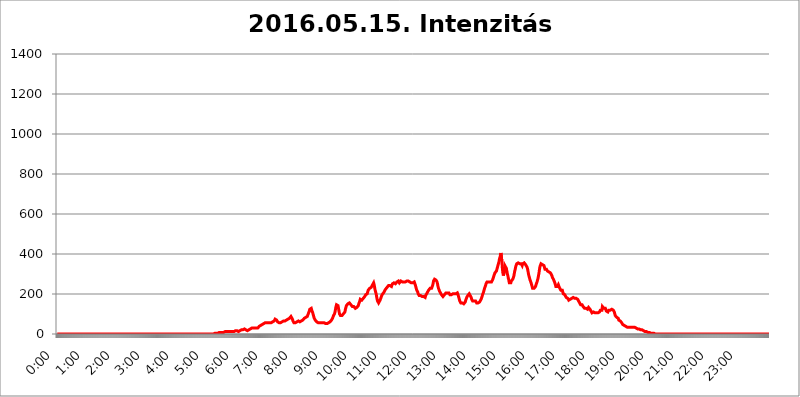
| Category | 2016.05.15. Intenzitás [W/m^2] |
|---|---|
| 0.0 | 0 |
| 0.0006944444444444445 | 0 |
| 0.001388888888888889 | 0 |
| 0.0020833333333333333 | 0 |
| 0.002777777777777778 | 0 |
| 0.003472222222222222 | 0 |
| 0.004166666666666667 | 0 |
| 0.004861111111111111 | 0 |
| 0.005555555555555556 | 0 |
| 0.0062499999999999995 | 0 |
| 0.006944444444444444 | 0 |
| 0.007638888888888889 | 0 |
| 0.008333333333333333 | 0 |
| 0.009027777777777779 | 0 |
| 0.009722222222222222 | 0 |
| 0.010416666666666666 | 0 |
| 0.011111111111111112 | 0 |
| 0.011805555555555555 | 0 |
| 0.012499999999999999 | 0 |
| 0.013194444444444444 | 0 |
| 0.013888888888888888 | 0 |
| 0.014583333333333332 | 0 |
| 0.015277777777777777 | 0 |
| 0.015972222222222224 | 0 |
| 0.016666666666666666 | 0 |
| 0.017361111111111112 | 0 |
| 0.018055555555555557 | 0 |
| 0.01875 | 0 |
| 0.019444444444444445 | 0 |
| 0.02013888888888889 | 0 |
| 0.020833333333333332 | 0 |
| 0.02152777777777778 | 0 |
| 0.022222222222222223 | 0 |
| 0.02291666666666667 | 0 |
| 0.02361111111111111 | 0 |
| 0.024305555555555556 | 0 |
| 0.024999999999999998 | 0 |
| 0.025694444444444447 | 0 |
| 0.02638888888888889 | 0 |
| 0.027083333333333334 | 0 |
| 0.027777777777777776 | 0 |
| 0.02847222222222222 | 0 |
| 0.029166666666666664 | 0 |
| 0.029861111111111113 | 0 |
| 0.030555555555555555 | 0 |
| 0.03125 | 0 |
| 0.03194444444444445 | 0 |
| 0.03263888888888889 | 0 |
| 0.03333333333333333 | 0 |
| 0.034027777777777775 | 0 |
| 0.034722222222222224 | 0 |
| 0.035416666666666666 | 0 |
| 0.036111111111111115 | 0 |
| 0.03680555555555556 | 0 |
| 0.0375 | 0 |
| 0.03819444444444444 | 0 |
| 0.03888888888888889 | 0 |
| 0.03958333333333333 | 0 |
| 0.04027777777777778 | 0 |
| 0.04097222222222222 | 0 |
| 0.041666666666666664 | 0 |
| 0.042361111111111106 | 0 |
| 0.04305555555555556 | 0 |
| 0.043750000000000004 | 0 |
| 0.044444444444444446 | 0 |
| 0.04513888888888889 | 0 |
| 0.04583333333333334 | 0 |
| 0.04652777777777778 | 0 |
| 0.04722222222222222 | 0 |
| 0.04791666666666666 | 0 |
| 0.04861111111111111 | 0 |
| 0.049305555555555554 | 0 |
| 0.049999999999999996 | 0 |
| 0.05069444444444445 | 0 |
| 0.051388888888888894 | 0 |
| 0.052083333333333336 | 0 |
| 0.05277777777777778 | 0 |
| 0.05347222222222222 | 0 |
| 0.05416666666666667 | 0 |
| 0.05486111111111111 | 0 |
| 0.05555555555555555 | 0 |
| 0.05625 | 0 |
| 0.05694444444444444 | 0 |
| 0.057638888888888885 | 0 |
| 0.05833333333333333 | 0 |
| 0.05902777777777778 | 0 |
| 0.059722222222222225 | 0 |
| 0.06041666666666667 | 0 |
| 0.061111111111111116 | 0 |
| 0.06180555555555556 | 0 |
| 0.0625 | 0 |
| 0.06319444444444444 | 0 |
| 0.06388888888888888 | 0 |
| 0.06458333333333334 | 0 |
| 0.06527777777777778 | 0 |
| 0.06597222222222222 | 0 |
| 0.06666666666666667 | 0 |
| 0.06736111111111111 | 0 |
| 0.06805555555555555 | 0 |
| 0.06874999999999999 | 0 |
| 0.06944444444444443 | 0 |
| 0.07013888888888889 | 0 |
| 0.07083333333333333 | 0 |
| 0.07152777777777779 | 0 |
| 0.07222222222222223 | 0 |
| 0.07291666666666667 | 0 |
| 0.07361111111111111 | 0 |
| 0.07430555555555556 | 0 |
| 0.075 | 0 |
| 0.07569444444444444 | 0 |
| 0.0763888888888889 | 0 |
| 0.07708333333333334 | 0 |
| 0.07777777777777778 | 0 |
| 0.07847222222222222 | 0 |
| 0.07916666666666666 | 0 |
| 0.0798611111111111 | 0 |
| 0.08055555555555556 | 0 |
| 0.08125 | 0 |
| 0.08194444444444444 | 0 |
| 0.08263888888888889 | 0 |
| 0.08333333333333333 | 0 |
| 0.08402777777777777 | 0 |
| 0.08472222222222221 | 0 |
| 0.08541666666666665 | 0 |
| 0.08611111111111112 | 0 |
| 0.08680555555555557 | 0 |
| 0.08750000000000001 | 0 |
| 0.08819444444444445 | 0 |
| 0.08888888888888889 | 0 |
| 0.08958333333333333 | 0 |
| 0.09027777777777778 | 0 |
| 0.09097222222222222 | 0 |
| 0.09166666666666667 | 0 |
| 0.09236111111111112 | 0 |
| 0.09305555555555556 | 0 |
| 0.09375 | 0 |
| 0.09444444444444444 | 0 |
| 0.09513888888888888 | 0 |
| 0.09583333333333333 | 0 |
| 0.09652777777777777 | 0 |
| 0.09722222222222222 | 0 |
| 0.09791666666666667 | 0 |
| 0.09861111111111111 | 0 |
| 0.09930555555555555 | 0 |
| 0.09999999999999999 | 0 |
| 0.10069444444444443 | 0 |
| 0.1013888888888889 | 0 |
| 0.10208333333333335 | 0 |
| 0.10277777777777779 | 0 |
| 0.10347222222222223 | 0 |
| 0.10416666666666667 | 0 |
| 0.10486111111111111 | 0 |
| 0.10555555555555556 | 0 |
| 0.10625 | 0 |
| 0.10694444444444444 | 0 |
| 0.1076388888888889 | 0 |
| 0.10833333333333334 | 0 |
| 0.10902777777777778 | 0 |
| 0.10972222222222222 | 0 |
| 0.1111111111111111 | 0 |
| 0.11180555555555556 | 0 |
| 0.11180555555555556 | 0 |
| 0.1125 | 0 |
| 0.11319444444444444 | 0 |
| 0.11388888888888889 | 0 |
| 0.11458333333333333 | 0 |
| 0.11527777777777777 | 0 |
| 0.11597222222222221 | 0 |
| 0.11666666666666665 | 0 |
| 0.1173611111111111 | 0 |
| 0.11805555555555557 | 0 |
| 0.11944444444444445 | 0 |
| 0.12013888888888889 | 0 |
| 0.12083333333333333 | 0 |
| 0.12152777777777778 | 0 |
| 0.12222222222222223 | 0 |
| 0.12291666666666667 | 0 |
| 0.12291666666666667 | 0 |
| 0.12361111111111112 | 0 |
| 0.12430555555555556 | 0 |
| 0.125 | 0 |
| 0.12569444444444444 | 0 |
| 0.12638888888888888 | 0 |
| 0.12708333333333333 | 0 |
| 0.16875 | 0 |
| 0.12847222222222224 | 0 |
| 0.12916666666666668 | 0 |
| 0.12986111111111112 | 0 |
| 0.13055555555555556 | 0 |
| 0.13125 | 0 |
| 0.13194444444444445 | 0 |
| 0.1326388888888889 | 0 |
| 0.13333333333333333 | 0 |
| 0.13402777777777777 | 0 |
| 0.13402777777777777 | 0 |
| 0.13472222222222222 | 0 |
| 0.13541666666666666 | 0 |
| 0.1361111111111111 | 0 |
| 0.13749999999999998 | 0 |
| 0.13819444444444443 | 0 |
| 0.1388888888888889 | 0 |
| 0.13958333333333334 | 0 |
| 0.14027777777777778 | 0 |
| 0.14097222222222222 | 0 |
| 0.14166666666666666 | 0 |
| 0.1423611111111111 | 0 |
| 0.14305555555555557 | 0 |
| 0.14375000000000002 | 0 |
| 0.14444444444444446 | 0 |
| 0.1451388888888889 | 0 |
| 0.1451388888888889 | 0 |
| 0.14652777777777778 | 0 |
| 0.14722222222222223 | 0 |
| 0.14791666666666667 | 0 |
| 0.1486111111111111 | 0 |
| 0.14930555555555555 | 0 |
| 0.15 | 0 |
| 0.15069444444444444 | 0 |
| 0.15138888888888888 | 0 |
| 0.15208333333333332 | 0 |
| 0.15277777777777776 | 0 |
| 0.15347222222222223 | 0 |
| 0.15416666666666667 | 0 |
| 0.15486111111111112 | 0 |
| 0.15555555555555556 | 0 |
| 0.15625 | 0 |
| 0.15694444444444444 | 0 |
| 0.15763888888888888 | 0 |
| 0.15833333333333333 | 0 |
| 0.15902777777777777 | 0 |
| 0.15972222222222224 | 0 |
| 0.16041666666666668 | 0 |
| 0.16111111111111112 | 0 |
| 0.16180555555555556 | 0 |
| 0.1625 | 0 |
| 0.16319444444444445 | 0 |
| 0.1638888888888889 | 0 |
| 0.16458333333333333 | 0 |
| 0.16527777777777777 | 0 |
| 0.16597222222222222 | 0 |
| 0.16666666666666666 | 0 |
| 0.1673611111111111 | 0 |
| 0.16805555555555554 | 0 |
| 0.16874999999999998 | 0 |
| 0.16944444444444443 | 0 |
| 0.17013888888888887 | 0 |
| 0.1708333333333333 | 0 |
| 0.17152777777777775 | 0 |
| 0.17222222222222225 | 0 |
| 0.1729166666666667 | 0 |
| 0.17361111111111113 | 0 |
| 0.17430555555555557 | 0 |
| 0.17500000000000002 | 0 |
| 0.17569444444444446 | 0 |
| 0.1763888888888889 | 0 |
| 0.17708333333333334 | 0 |
| 0.17777777777777778 | 0 |
| 0.17847222222222223 | 0 |
| 0.17916666666666667 | 0 |
| 0.1798611111111111 | 0 |
| 0.18055555555555555 | 0 |
| 0.18125 | 0 |
| 0.18194444444444444 | 0 |
| 0.1826388888888889 | 0 |
| 0.18333333333333335 | 0 |
| 0.1840277777777778 | 0 |
| 0.18472222222222223 | 0 |
| 0.18541666666666667 | 0 |
| 0.18611111111111112 | 0 |
| 0.18680555555555556 | 0 |
| 0.1875 | 0 |
| 0.18819444444444444 | 0 |
| 0.18888888888888888 | 0 |
| 0.18958333333333333 | 0 |
| 0.19027777777777777 | 0 |
| 0.1909722222222222 | 0 |
| 0.19166666666666665 | 0 |
| 0.19236111111111112 | 0 |
| 0.19305555555555554 | 0 |
| 0.19375 | 0 |
| 0.19444444444444445 | 0 |
| 0.1951388888888889 | 0 |
| 0.19583333333333333 | 0 |
| 0.19652777777777777 | 0 |
| 0.19722222222222222 | 0 |
| 0.19791666666666666 | 0 |
| 0.1986111111111111 | 0 |
| 0.19930555555555554 | 0 |
| 0.19999999999999998 | 0 |
| 0.20069444444444443 | 0 |
| 0.20138888888888887 | 0 |
| 0.2020833333333333 | 0 |
| 0.2027777777777778 | 0 |
| 0.2034722222222222 | 0 |
| 0.2041666666666667 | 0 |
| 0.20486111111111113 | 0 |
| 0.20555555555555557 | 0 |
| 0.20625000000000002 | 0 |
| 0.20694444444444446 | 0 |
| 0.2076388888888889 | 0 |
| 0.20833333333333334 | 0 |
| 0.20902777777777778 | 0 |
| 0.20972222222222223 | 0 |
| 0.21041666666666667 | 0 |
| 0.2111111111111111 | 0 |
| 0.21180555555555555 | 0 |
| 0.2125 | 0 |
| 0.21319444444444444 | 0 |
| 0.2138888888888889 | 0 |
| 0.21458333333333335 | 0 |
| 0.2152777777777778 | 0 |
| 0.21597222222222223 | 0 |
| 0.21666666666666667 | 0 |
| 0.21736111111111112 | 0 |
| 0.21805555555555556 | 0 |
| 0.21875 | 0 |
| 0.21944444444444444 | 3.525 |
| 0.22013888888888888 | 3.525 |
| 0.22083333333333333 | 3.525 |
| 0.22152777777777777 | 3.525 |
| 0.2222222222222222 | 3.525 |
| 0.22291666666666665 | 3.525 |
| 0.2236111111111111 | 3.525 |
| 0.22430555555555556 | 3.525 |
| 0.225 | 3.525 |
| 0.22569444444444445 | 3.525 |
| 0.2263888888888889 | 7.887 |
| 0.22708333333333333 | 7.887 |
| 0.22777777777777777 | 7.887 |
| 0.22847222222222222 | 7.887 |
| 0.22916666666666666 | 7.887 |
| 0.2298611111111111 | 7.887 |
| 0.23055555555555554 | 7.887 |
| 0.23124999999999998 | 7.887 |
| 0.23194444444444443 | 7.887 |
| 0.23263888888888887 | 7.887 |
| 0.2333333333333333 | 7.887 |
| 0.2340277777777778 | 7.887 |
| 0.2347222222222222 | 12.257 |
| 0.2354166666666667 | 12.257 |
| 0.23611111111111113 | 12.257 |
| 0.23680555555555557 | 12.257 |
| 0.23750000000000002 | 12.257 |
| 0.23819444444444446 | 12.257 |
| 0.2388888888888889 | 12.257 |
| 0.23958333333333334 | 12.257 |
| 0.24027777777777778 | 12.257 |
| 0.24097222222222223 | 12.257 |
| 0.24166666666666667 | 12.257 |
| 0.2423611111111111 | 7.887 |
| 0.24305555555555555 | 7.887 |
| 0.24375 | 12.257 |
| 0.24444444444444446 | 7.887 |
| 0.24513888888888888 | 12.257 |
| 0.24583333333333335 | 12.257 |
| 0.2465277777777778 | 12.257 |
| 0.24722222222222223 | 12.257 |
| 0.24791666666666667 | 12.257 |
| 0.24861111111111112 | 12.257 |
| 0.24930555555555556 | 12.257 |
| 0.25 | 16.636 |
| 0.25069444444444444 | 16.636 |
| 0.2513888888888889 | 16.636 |
| 0.2520833333333333 | 16.636 |
| 0.25277777777777777 | 16.636 |
| 0.2534722222222222 | 12.257 |
| 0.25416666666666665 | 12.257 |
| 0.2548611111111111 | 12.257 |
| 0.2555555555555556 | 12.257 |
| 0.25625000000000003 | 16.636 |
| 0.2569444444444445 | 16.636 |
| 0.2576388888888889 | 16.636 |
| 0.25833333333333336 | 21.024 |
| 0.2590277777777778 | 21.024 |
| 0.25972222222222224 | 21.024 |
| 0.2604166666666667 | 21.024 |
| 0.2611111111111111 | 25.419 |
| 0.26180555555555557 | 25.419 |
| 0.2625 | 25.419 |
| 0.26319444444444445 | 25.419 |
| 0.2638888888888889 | 21.024 |
| 0.26458333333333334 | 21.024 |
| 0.2652777777777778 | 21.024 |
| 0.2659722222222222 | 16.636 |
| 0.26666666666666666 | 16.636 |
| 0.2673611111111111 | 16.636 |
| 0.26805555555555555 | 16.636 |
| 0.26875 | 21.024 |
| 0.26944444444444443 | 21.024 |
| 0.2701388888888889 | 25.419 |
| 0.2708333333333333 | 25.419 |
| 0.27152777777777776 | 25.419 |
| 0.2722222222222222 | 29.823 |
| 0.27291666666666664 | 29.823 |
| 0.2736111111111111 | 29.823 |
| 0.2743055555555555 | 29.823 |
| 0.27499999999999997 | 29.823 |
| 0.27569444444444446 | 29.823 |
| 0.27638888888888885 | 29.823 |
| 0.27708333333333335 | 29.823 |
| 0.2777777777777778 | 29.823 |
| 0.27847222222222223 | 29.823 |
| 0.2791666666666667 | 29.823 |
| 0.2798611111111111 | 29.823 |
| 0.28055555555555556 | 29.823 |
| 0.28125 | 29.823 |
| 0.28194444444444444 | 29.823 |
| 0.2826388888888889 | 34.234 |
| 0.2833333333333333 | 38.653 |
| 0.28402777777777777 | 38.653 |
| 0.2847222222222222 | 43.079 |
| 0.28541666666666665 | 43.079 |
| 0.28611111111111115 | 47.511 |
| 0.28680555555555554 | 47.511 |
| 0.28750000000000003 | 47.511 |
| 0.2881944444444445 | 51.951 |
| 0.2888888888888889 | 51.951 |
| 0.28958333333333336 | 51.951 |
| 0.2902777777777778 | 56.398 |
| 0.29097222222222224 | 56.398 |
| 0.2916666666666667 | 56.398 |
| 0.2923611111111111 | 56.398 |
| 0.29305555555555557 | 51.951 |
| 0.29375 | 56.398 |
| 0.29444444444444445 | 56.398 |
| 0.2951388888888889 | 56.398 |
| 0.29583333333333334 | 56.398 |
| 0.2965277777777778 | 56.398 |
| 0.2972222222222222 | 56.398 |
| 0.29791666666666666 | 56.398 |
| 0.2986111111111111 | 56.398 |
| 0.29930555555555555 | 56.398 |
| 0.3 | 56.398 |
| 0.30069444444444443 | 56.398 |
| 0.3013888888888889 | 60.85 |
| 0.3020833333333333 | 60.85 |
| 0.30277777777777776 | 65.31 |
| 0.3034722222222222 | 65.31 |
| 0.30416666666666664 | 65.31 |
| 0.3048611111111111 | 69.775 |
| 0.3055555555555555 | 74.246 |
| 0.30624999999999997 | 74.246 |
| 0.3069444444444444 | 74.246 |
| 0.3076388888888889 | 69.775 |
| 0.30833333333333335 | 65.31 |
| 0.3090277777777778 | 60.85 |
| 0.30972222222222223 | 56.398 |
| 0.3104166666666667 | 56.398 |
| 0.3111111111111111 | 56.398 |
| 0.31180555555555556 | 56.398 |
| 0.3125 | 56.398 |
| 0.31319444444444444 | 56.398 |
| 0.3138888888888889 | 60.85 |
| 0.3145833333333333 | 60.85 |
| 0.31527777777777777 | 60.85 |
| 0.3159722222222222 | 60.85 |
| 0.31666666666666665 | 65.31 |
| 0.31736111111111115 | 65.31 |
| 0.31805555555555554 | 65.31 |
| 0.31875000000000003 | 65.31 |
| 0.3194444444444445 | 65.31 |
| 0.3201388888888889 | 65.31 |
| 0.32083333333333336 | 65.31 |
| 0.3215277777777778 | 69.775 |
| 0.32222222222222224 | 69.775 |
| 0.3229166666666667 | 69.775 |
| 0.3236111111111111 | 74.246 |
| 0.32430555555555557 | 74.246 |
| 0.325 | 78.722 |
| 0.32569444444444445 | 78.722 |
| 0.3263888888888889 | 83.205 |
| 0.32708333333333334 | 83.205 |
| 0.3277777777777778 | 87.692 |
| 0.3284722222222222 | 87.692 |
| 0.32916666666666666 | 83.205 |
| 0.3298611111111111 | 74.246 |
| 0.33055555555555555 | 65.31 |
| 0.33125 | 60.85 |
| 0.33194444444444443 | 56.398 |
| 0.3326388888888889 | 56.398 |
| 0.3333333333333333 | 56.398 |
| 0.3340277777777778 | 56.398 |
| 0.3347222222222222 | 56.398 |
| 0.3354166666666667 | 60.85 |
| 0.3361111111111111 | 60.85 |
| 0.3368055555555556 | 60.85 |
| 0.33749999999999997 | 60.85 |
| 0.33819444444444446 | 65.31 |
| 0.33888888888888885 | 65.31 |
| 0.33958333333333335 | 65.31 |
| 0.34027777777777773 | 60.85 |
| 0.34097222222222223 | 65.31 |
| 0.3416666666666666 | 60.85 |
| 0.3423611111111111 | 65.31 |
| 0.3430555555555555 | 65.31 |
| 0.34375 | 65.31 |
| 0.3444444444444445 | 69.775 |
| 0.3451388888888889 | 74.246 |
| 0.3458333333333334 | 74.246 |
| 0.34652777777777777 | 78.722 |
| 0.34722222222222227 | 83.205 |
| 0.34791666666666665 | 83.205 |
| 0.34861111111111115 | 83.205 |
| 0.34930555555555554 | 83.205 |
| 0.35000000000000003 | 83.205 |
| 0.3506944444444444 | 87.692 |
| 0.3513888888888889 | 92.184 |
| 0.3520833333333333 | 101.184 |
| 0.3527777777777778 | 105.69 |
| 0.3534722222222222 | 114.716 |
| 0.3541666666666667 | 123.758 |
| 0.3548611111111111 | 128.284 |
| 0.35555555555555557 | 128.284 |
| 0.35625 | 128.284 |
| 0.35694444444444445 | 119.235 |
| 0.3576388888888889 | 114.716 |
| 0.35833333333333334 | 105.69 |
| 0.3590277777777778 | 96.682 |
| 0.3597222222222222 | 87.692 |
| 0.36041666666666666 | 78.722 |
| 0.3611111111111111 | 74.246 |
| 0.36180555555555555 | 69.775 |
| 0.3625 | 65.31 |
| 0.36319444444444443 | 65.31 |
| 0.3638888888888889 | 60.85 |
| 0.3645833333333333 | 60.85 |
| 0.3652777777777778 | 56.398 |
| 0.3659722222222222 | 56.398 |
| 0.3666666666666667 | 56.398 |
| 0.3673611111111111 | 56.398 |
| 0.3680555555555556 | 56.398 |
| 0.36874999999999997 | 60.85 |
| 0.36944444444444446 | 60.85 |
| 0.37013888888888885 | 56.398 |
| 0.37083333333333335 | 56.398 |
| 0.37152777777777773 | 56.398 |
| 0.37222222222222223 | 56.398 |
| 0.3729166666666666 | 56.398 |
| 0.3736111111111111 | 56.398 |
| 0.3743055555555555 | 56.398 |
| 0.375 | 51.951 |
| 0.3756944444444445 | 51.951 |
| 0.3763888888888889 | 51.951 |
| 0.3770833333333334 | 51.951 |
| 0.37777777777777777 | 51.951 |
| 0.37847222222222227 | 51.951 |
| 0.37916666666666665 | 56.398 |
| 0.37986111111111115 | 56.398 |
| 0.38055555555555554 | 56.398 |
| 0.38125000000000003 | 60.85 |
| 0.3819444444444444 | 60.85 |
| 0.3826388888888889 | 60.85 |
| 0.3833333333333333 | 65.31 |
| 0.3840277777777778 | 65.31 |
| 0.3847222222222222 | 69.775 |
| 0.3854166666666667 | 74.246 |
| 0.3861111111111111 | 78.722 |
| 0.38680555555555557 | 83.205 |
| 0.3875 | 92.184 |
| 0.38819444444444445 | 96.682 |
| 0.3888888888888889 | 101.184 |
| 0.38958333333333334 | 110.201 |
| 0.3902777777777778 | 123.758 |
| 0.3909722222222222 | 137.347 |
| 0.39166666666666666 | 146.423 |
| 0.3923611111111111 | 150.964 |
| 0.39305555555555555 | 146.423 |
| 0.39375 | 141.884 |
| 0.39444444444444443 | 128.284 |
| 0.3951388888888889 | 114.716 |
| 0.3958333333333333 | 101.184 |
| 0.3965277777777778 | 96.682 |
| 0.3972222222222222 | 92.184 |
| 0.3979166666666667 | 92.184 |
| 0.3986111111111111 | 92.184 |
| 0.3993055555555556 | 92.184 |
| 0.39999999999999997 | 96.682 |
| 0.40069444444444446 | 96.682 |
| 0.40138888888888885 | 101.184 |
| 0.40208333333333335 | 101.184 |
| 0.40277777777777773 | 101.184 |
| 0.40347222222222223 | 110.201 |
| 0.4041666666666666 | 123.758 |
| 0.4048611111111111 | 132.814 |
| 0.4055555555555555 | 141.884 |
| 0.40625 | 146.423 |
| 0.4069444444444445 | 146.423 |
| 0.4076388888888889 | 150.964 |
| 0.4083333333333334 | 150.964 |
| 0.40902777777777777 | 155.509 |
| 0.40972222222222227 | 155.509 |
| 0.41041666666666665 | 150.964 |
| 0.41111111111111115 | 150.964 |
| 0.41180555555555554 | 146.423 |
| 0.41250000000000003 | 146.423 |
| 0.4131944444444444 | 141.884 |
| 0.4138888888888889 | 137.347 |
| 0.4145833333333333 | 132.814 |
| 0.4152777777777778 | 132.814 |
| 0.4159722222222222 | 137.347 |
| 0.4166666666666667 | 137.347 |
| 0.4173611111111111 | 132.814 |
| 0.41805555555555557 | 128.284 |
| 0.41875 | 128.284 |
| 0.41944444444444445 | 128.284 |
| 0.4201388888888889 | 132.814 |
| 0.42083333333333334 | 132.814 |
| 0.4215277777777778 | 137.347 |
| 0.4222222222222222 | 141.884 |
| 0.42291666666666666 | 150.964 |
| 0.4236111111111111 | 155.509 |
| 0.42430555555555555 | 164.605 |
| 0.425 | 173.709 |
| 0.42569444444444443 | 178.264 |
| 0.4263888888888889 | 173.709 |
| 0.4270833333333333 | 169.156 |
| 0.4277777777777778 | 169.156 |
| 0.4284722222222222 | 173.709 |
| 0.4291666666666667 | 178.264 |
| 0.4298611111111111 | 182.82 |
| 0.4305555555555556 | 182.82 |
| 0.43124999999999997 | 187.378 |
| 0.43194444444444446 | 191.937 |
| 0.43263888888888885 | 196.497 |
| 0.43333333333333335 | 196.497 |
| 0.43402777777777773 | 201.058 |
| 0.43472222222222223 | 201.058 |
| 0.4354166666666666 | 210.182 |
| 0.4361111111111111 | 219.309 |
| 0.4368055555555555 | 223.873 |
| 0.4375 | 223.873 |
| 0.4381944444444445 | 228.436 |
| 0.4388888888888889 | 228.436 |
| 0.4395833333333334 | 228.436 |
| 0.44027777777777777 | 233 |
| 0.44097222222222227 | 233 |
| 0.44166666666666665 | 237.564 |
| 0.44236111111111115 | 246.689 |
| 0.44305555555555554 | 251.251 |
| 0.44375000000000003 | 255.813 |
| 0.4444444444444444 | 246.689 |
| 0.4451388888888889 | 233 |
| 0.4458333333333333 | 219.309 |
| 0.4465277777777778 | 210.182 |
| 0.4472222222222222 | 201.058 |
| 0.4479166666666667 | 187.378 |
| 0.4486111111111111 | 173.709 |
| 0.44930555555555557 | 164.605 |
| 0.45 | 160.056 |
| 0.45069444444444445 | 155.509 |
| 0.4513888888888889 | 155.509 |
| 0.45208333333333334 | 160.056 |
| 0.4527777777777778 | 169.156 |
| 0.4534722222222222 | 173.709 |
| 0.45416666666666666 | 182.82 |
| 0.4548611111111111 | 187.378 |
| 0.45555555555555555 | 196.497 |
| 0.45625 | 196.497 |
| 0.45694444444444443 | 201.058 |
| 0.4576388888888889 | 205.62 |
| 0.4583333333333333 | 210.182 |
| 0.4590277777777778 | 214.746 |
| 0.4597222222222222 | 219.309 |
| 0.4604166666666667 | 223.873 |
| 0.4611111111111111 | 228.436 |
| 0.4618055555555556 | 228.436 |
| 0.46249999999999997 | 233 |
| 0.46319444444444446 | 237.564 |
| 0.46388888888888885 | 237.564 |
| 0.46458333333333335 | 242.127 |
| 0.46527777777777773 | 242.127 |
| 0.46597222222222223 | 242.127 |
| 0.4666666666666666 | 242.127 |
| 0.4673611111111111 | 237.564 |
| 0.4680555555555555 | 237.564 |
| 0.46875 | 237.564 |
| 0.4694444444444445 | 242.127 |
| 0.4701388888888889 | 251.251 |
| 0.4708333333333334 | 255.813 |
| 0.47152777777777777 | 255.813 |
| 0.47222222222222227 | 255.813 |
| 0.47291666666666665 | 255.813 |
| 0.47361111111111115 | 251.251 |
| 0.47430555555555554 | 251.251 |
| 0.47500000000000003 | 251.251 |
| 0.4756944444444444 | 255.813 |
| 0.4763888888888889 | 260.373 |
| 0.4770833333333333 | 264.932 |
| 0.4777777777777778 | 264.932 |
| 0.4784722222222222 | 264.932 |
| 0.4791666666666667 | 260.373 |
| 0.4798611111111111 | 255.813 |
| 0.48055555555555557 | 255.813 |
| 0.48125 | 260.373 |
| 0.48194444444444445 | 264.932 |
| 0.4826388888888889 | 269.49 |
| 0.48333333333333334 | 264.932 |
| 0.4840277777777778 | 260.373 |
| 0.4847222222222222 | 255.813 |
| 0.48541666666666666 | 255.813 |
| 0.4861111111111111 | 260.373 |
| 0.48680555555555555 | 264.932 |
| 0.4875 | 264.932 |
| 0.48819444444444443 | 260.373 |
| 0.4888888888888889 | 260.373 |
| 0.4895833333333333 | 260.373 |
| 0.4902777777777778 | 264.932 |
| 0.4909722222222222 | 264.932 |
| 0.4916666666666667 | 269.49 |
| 0.4923611111111111 | 264.932 |
| 0.4930555555555556 | 260.373 |
| 0.49374999999999997 | 260.373 |
| 0.49444444444444446 | 260.373 |
| 0.49513888888888885 | 264.932 |
| 0.49583333333333335 | 260.373 |
| 0.49652777777777773 | 255.813 |
| 0.49722222222222223 | 251.251 |
| 0.4979166666666666 | 251.251 |
| 0.4986111111111111 | 255.813 |
| 0.4993055555555555 | 260.373 |
| 0.5 | 260.373 |
| 0.5006944444444444 | 260.373 |
| 0.5013888888888889 | 255.813 |
| 0.5020833333333333 | 246.689 |
| 0.5027777777777778 | 237.564 |
| 0.5034722222222222 | 228.436 |
| 0.5041666666666667 | 219.309 |
| 0.5048611111111111 | 214.746 |
| 0.5055555555555555 | 210.182 |
| 0.50625 | 201.058 |
| 0.5069444444444444 | 196.497 |
| 0.5076388888888889 | 191.937 |
| 0.5083333333333333 | 191.937 |
| 0.5090277777777777 | 191.937 |
| 0.5097222222222222 | 191.937 |
| 0.5104166666666666 | 187.378 |
| 0.5111111111111112 | 187.378 |
| 0.5118055555555555 | 187.378 |
| 0.5125000000000001 | 187.378 |
| 0.5131944444444444 | 187.378 |
| 0.513888888888889 | 187.378 |
| 0.5145833333333333 | 182.82 |
| 0.5152777777777778 | 182.82 |
| 0.5159722222222222 | 182.82 |
| 0.5166666666666667 | 191.937 |
| 0.517361111111111 | 191.937 |
| 0.5180555555555556 | 201.058 |
| 0.5187499999999999 | 201.058 |
| 0.5194444444444445 | 210.182 |
| 0.5201388888888888 | 214.746 |
| 0.5208333333333334 | 219.309 |
| 0.5215277777777778 | 223.873 |
| 0.5222222222222223 | 223.873 |
| 0.5229166666666667 | 228.436 |
| 0.5236111111111111 | 228.436 |
| 0.5243055555555556 | 228.436 |
| 0.525 | 228.436 |
| 0.5256944444444445 | 233 |
| 0.5263888888888889 | 242.127 |
| 0.5270833333333333 | 251.251 |
| 0.5277777777777778 | 264.932 |
| 0.5284722222222222 | 269.49 |
| 0.5291666666666667 | 274.047 |
| 0.5298611111111111 | 274.047 |
| 0.5305555555555556 | 274.047 |
| 0.53125 | 269.49 |
| 0.5319444444444444 | 264.932 |
| 0.5326388888888889 | 260.373 |
| 0.5333333333333333 | 251.251 |
| 0.5340277777777778 | 237.564 |
| 0.5347222222222222 | 228.436 |
| 0.5354166666666667 | 223.873 |
| 0.5361111111111111 | 214.746 |
| 0.5368055555555555 | 210.182 |
| 0.5375 | 205.62 |
| 0.5381944444444444 | 201.058 |
| 0.5388888888888889 | 196.497 |
| 0.5395833333333333 | 191.937 |
| 0.5402777777777777 | 191.937 |
| 0.5409722222222222 | 187.378 |
| 0.5416666666666666 | 187.378 |
| 0.5423611111111112 | 191.937 |
| 0.5430555555555555 | 196.497 |
| 0.5437500000000001 | 201.058 |
| 0.5444444444444444 | 201.058 |
| 0.545138888888889 | 205.62 |
| 0.5458333333333333 | 205.62 |
| 0.5465277777777778 | 205.62 |
| 0.5472222222222222 | 205.62 |
| 0.5479166666666667 | 205.62 |
| 0.548611111111111 | 210.182 |
| 0.5493055555555556 | 205.62 |
| 0.5499999999999999 | 201.058 |
| 0.5506944444444445 | 196.497 |
| 0.5513888888888888 | 191.937 |
| 0.5520833333333334 | 191.937 |
| 0.5527777777777778 | 196.497 |
| 0.5534722222222223 | 196.497 |
| 0.5541666666666667 | 201.058 |
| 0.5548611111111111 | 201.058 |
| 0.5555555555555556 | 201.058 |
| 0.55625 | 201.058 |
| 0.5569444444444445 | 201.058 |
| 0.5576388888888889 | 201.058 |
| 0.5583333333333333 | 201.058 |
| 0.5590277777777778 | 201.058 |
| 0.5597222222222222 | 205.62 |
| 0.5604166666666667 | 205.62 |
| 0.5611111111111111 | 205.62 |
| 0.5618055555555556 | 201.058 |
| 0.5625 | 191.937 |
| 0.5631944444444444 | 182.82 |
| 0.5638888888888889 | 173.709 |
| 0.5645833333333333 | 164.605 |
| 0.5652777777777778 | 160.056 |
| 0.5659722222222222 | 155.509 |
| 0.5666666666666667 | 155.509 |
| 0.5673611111111111 | 155.509 |
| 0.5680555555555555 | 155.509 |
| 0.56875 | 155.509 |
| 0.5694444444444444 | 150.964 |
| 0.5701388888888889 | 150.964 |
| 0.5708333333333333 | 150.964 |
| 0.5715277777777777 | 155.509 |
| 0.5722222222222222 | 160.056 |
| 0.5729166666666666 | 169.156 |
| 0.5736111111111112 | 173.709 |
| 0.5743055555555555 | 182.82 |
| 0.5750000000000001 | 187.378 |
| 0.5756944444444444 | 191.937 |
| 0.576388888888889 | 196.497 |
| 0.5770833333333333 | 196.497 |
| 0.5777777777777778 | 201.058 |
| 0.5784722222222222 | 196.497 |
| 0.5791666666666667 | 191.937 |
| 0.579861111111111 | 187.378 |
| 0.5805555555555556 | 182.82 |
| 0.5812499999999999 | 173.709 |
| 0.5819444444444445 | 169.156 |
| 0.5826388888888888 | 164.605 |
| 0.5833333333333334 | 164.605 |
| 0.5840277777777778 | 164.605 |
| 0.5847222222222223 | 164.605 |
| 0.5854166666666667 | 169.156 |
| 0.5861111111111111 | 164.605 |
| 0.5868055555555556 | 164.605 |
| 0.5875 | 160.056 |
| 0.5881944444444445 | 155.509 |
| 0.5888888888888889 | 155.509 |
| 0.5895833333333333 | 155.509 |
| 0.5902777777777778 | 155.509 |
| 0.5909722222222222 | 155.509 |
| 0.5916666666666667 | 155.509 |
| 0.5923611111111111 | 160.056 |
| 0.5930555555555556 | 160.056 |
| 0.59375 | 164.605 |
| 0.5944444444444444 | 173.709 |
| 0.5951388888888889 | 178.264 |
| 0.5958333333333333 | 187.378 |
| 0.5965277777777778 | 196.497 |
| 0.5972222222222222 | 201.058 |
| 0.5979166666666667 | 210.182 |
| 0.5986111111111111 | 219.309 |
| 0.5993055555555555 | 228.436 |
| 0.6 | 233 |
| 0.6006944444444444 | 242.127 |
| 0.6013888888888889 | 251.251 |
| 0.6020833333333333 | 255.813 |
| 0.6027777777777777 | 260.373 |
| 0.6034722222222222 | 264.932 |
| 0.6041666666666666 | 264.932 |
| 0.6048611111111112 | 260.373 |
| 0.6055555555555555 | 260.373 |
| 0.6062500000000001 | 260.373 |
| 0.6069444444444444 | 260.373 |
| 0.607638888888889 | 260.373 |
| 0.6083333333333333 | 260.373 |
| 0.6090277777777778 | 260.373 |
| 0.6097222222222222 | 264.932 |
| 0.6104166666666667 | 269.49 |
| 0.611111111111111 | 274.047 |
| 0.6118055555555556 | 283.156 |
| 0.6124999999999999 | 292.259 |
| 0.6131944444444445 | 296.808 |
| 0.6138888888888888 | 305.898 |
| 0.6145833333333334 | 310.44 |
| 0.6152777777777778 | 310.44 |
| 0.6159722222222223 | 314.98 |
| 0.6166666666666667 | 319.517 |
| 0.6173611111111111 | 333.113 |
| 0.6180555555555556 | 337.639 |
| 0.61875 | 351.198 |
| 0.6194444444444445 | 360.221 |
| 0.6201388888888889 | 373.729 |
| 0.6208333333333333 | 382.715 |
| 0.6215277777777778 | 391.685 |
| 0.6222222222222222 | 405.108 |
| 0.6229166666666667 | 400.638 |
| 0.6236111111111111 | 364.728 |
| 0.6243055555555556 | 328.584 |
| 0.625 | 305.898 |
| 0.6256944444444444 | 292.259 |
| 0.6263888888888889 | 301.354 |
| 0.6270833333333333 | 324.052 |
| 0.6277777777777778 | 342.162 |
| 0.6284722222222222 | 346.682 |
| 0.6291666666666667 | 342.162 |
| 0.6298611111111111 | 328.584 |
| 0.6305555555555555 | 314.98 |
| 0.63125 | 301.354 |
| 0.6319444444444444 | 292.259 |
| 0.6326388888888889 | 278.603 |
| 0.6333333333333333 | 269.49 |
| 0.6340277777777777 | 255.813 |
| 0.6347222222222222 | 251.251 |
| 0.6354166666666666 | 251.251 |
| 0.6361111111111112 | 255.813 |
| 0.6368055555555555 | 264.932 |
| 0.6375000000000001 | 269.49 |
| 0.6381944444444444 | 269.49 |
| 0.638888888888889 | 274.047 |
| 0.6395833333333333 | 278.603 |
| 0.6402777777777778 | 287.709 |
| 0.6409722222222222 | 301.354 |
| 0.6416666666666667 | 314.98 |
| 0.642361111111111 | 324.052 |
| 0.6430555555555556 | 337.639 |
| 0.6437499999999999 | 342.162 |
| 0.6444444444444445 | 351.198 |
| 0.6451388888888888 | 351.198 |
| 0.6458333333333334 | 355.712 |
| 0.6465277777777778 | 355.712 |
| 0.6472222222222223 | 351.198 |
| 0.6479166666666667 | 355.712 |
| 0.6486111111111111 | 351.198 |
| 0.6493055555555556 | 355.712 |
| 0.65 | 351.198 |
| 0.6506944444444445 | 351.198 |
| 0.6513888888888889 | 346.682 |
| 0.6520833333333333 | 342.162 |
| 0.6527777777777778 | 351.198 |
| 0.6534722222222222 | 351.198 |
| 0.6541666666666667 | 355.712 |
| 0.6548611111111111 | 355.712 |
| 0.6555555555555556 | 351.198 |
| 0.65625 | 351.198 |
| 0.6569444444444444 | 346.682 |
| 0.6576388888888889 | 346.682 |
| 0.6583333333333333 | 342.162 |
| 0.6590277777777778 | 333.113 |
| 0.6597222222222222 | 324.052 |
| 0.6604166666666667 | 310.44 |
| 0.6611111111111111 | 296.808 |
| 0.6618055555555555 | 287.709 |
| 0.6625 | 278.603 |
| 0.6631944444444444 | 269.49 |
| 0.6638888888888889 | 264.932 |
| 0.6645833333333333 | 255.813 |
| 0.6652777777777777 | 246.689 |
| 0.6659722222222222 | 237.564 |
| 0.6666666666666666 | 228.436 |
| 0.6673611111111111 | 223.873 |
| 0.6680555555555556 | 223.873 |
| 0.6687500000000001 | 228.436 |
| 0.6694444444444444 | 228.436 |
| 0.6701388888888888 | 233 |
| 0.6708333333333334 | 237.564 |
| 0.6715277777777778 | 246.689 |
| 0.6722222222222222 | 251.251 |
| 0.6729166666666666 | 260.373 |
| 0.6736111111111112 | 269.49 |
| 0.6743055555555556 | 278.603 |
| 0.6749999999999999 | 292.259 |
| 0.6756944444444444 | 305.898 |
| 0.6763888888888889 | 324.052 |
| 0.6770833333333334 | 337.639 |
| 0.6777777777777777 | 342.162 |
| 0.6784722222222223 | 351.198 |
| 0.6791666666666667 | 346.682 |
| 0.6798611111111111 | 346.682 |
| 0.6805555555555555 | 346.682 |
| 0.68125 | 346.682 |
| 0.6819444444444445 | 342.162 |
| 0.6826388888888889 | 342.162 |
| 0.6833333333333332 | 333.113 |
| 0.6840277777777778 | 324.052 |
| 0.6847222222222222 | 324.052 |
| 0.6854166666666667 | 324.052 |
| 0.686111111111111 | 324.052 |
| 0.6868055555555556 | 324.052 |
| 0.6875 | 314.98 |
| 0.6881944444444444 | 310.44 |
| 0.688888888888889 | 310.44 |
| 0.6895833333333333 | 310.44 |
| 0.6902777777777778 | 305.898 |
| 0.6909722222222222 | 305.898 |
| 0.6916666666666668 | 305.898 |
| 0.6923611111111111 | 305.898 |
| 0.6930555555555555 | 301.354 |
| 0.69375 | 292.259 |
| 0.6944444444444445 | 283.156 |
| 0.6951388888888889 | 278.603 |
| 0.6958333333333333 | 274.047 |
| 0.6965277777777777 | 274.047 |
| 0.6972222222222223 | 269.49 |
| 0.6979166666666666 | 255.813 |
| 0.6986111111111111 | 246.689 |
| 0.6993055555555556 | 237.564 |
| 0.7000000000000001 | 233 |
| 0.7006944444444444 | 233 |
| 0.7013888888888888 | 237.564 |
| 0.7020833333333334 | 242.127 |
| 0.7027777777777778 | 246.689 |
| 0.7034722222222222 | 242.127 |
| 0.7041666666666666 | 233 |
| 0.7048611111111112 | 228.436 |
| 0.7055555555555556 | 228.436 |
| 0.7062499999999999 | 219.309 |
| 0.7069444444444444 | 219.309 |
| 0.7076388888888889 | 214.746 |
| 0.7083333333333334 | 219.309 |
| 0.7090277777777777 | 214.746 |
| 0.7097222222222223 | 201.058 |
| 0.7104166666666667 | 201.058 |
| 0.7111111111111111 | 196.497 |
| 0.7118055555555555 | 196.497 |
| 0.7125 | 196.497 |
| 0.7131944444444445 | 191.937 |
| 0.7138888888888889 | 182.82 |
| 0.7145833333333332 | 182.82 |
| 0.7152777777777778 | 178.264 |
| 0.7159722222222222 | 178.264 |
| 0.7166666666666667 | 173.709 |
| 0.717361111111111 | 169.156 |
| 0.7180555555555556 | 169.156 |
| 0.71875 | 169.156 |
| 0.7194444444444444 | 173.709 |
| 0.720138888888889 | 173.709 |
| 0.7208333333333333 | 173.709 |
| 0.7215277777777778 | 178.264 |
| 0.7222222222222222 | 182.82 |
| 0.7229166666666668 | 182.82 |
| 0.7236111111111111 | 182.82 |
| 0.7243055555555555 | 182.82 |
| 0.725 | 178.264 |
| 0.7256944444444445 | 178.264 |
| 0.7263888888888889 | 178.264 |
| 0.7270833333333333 | 178.264 |
| 0.7277777777777777 | 178.264 |
| 0.7284722222222223 | 178.264 |
| 0.7291666666666666 | 173.709 |
| 0.7298611111111111 | 173.709 |
| 0.7305555555555556 | 169.156 |
| 0.7312500000000001 | 164.605 |
| 0.7319444444444444 | 164.605 |
| 0.7326388888888888 | 155.509 |
| 0.7333333333333334 | 150.964 |
| 0.7340277777777778 | 146.423 |
| 0.7347222222222222 | 146.423 |
| 0.7354166666666666 | 146.423 |
| 0.7361111111111112 | 146.423 |
| 0.7368055555555556 | 141.884 |
| 0.7374999999999999 | 137.347 |
| 0.7381944444444444 | 137.347 |
| 0.7388888888888889 | 132.814 |
| 0.7395833333333334 | 128.284 |
| 0.7402777777777777 | 128.284 |
| 0.7409722222222223 | 128.284 |
| 0.7416666666666667 | 128.284 |
| 0.7423611111111111 | 128.284 |
| 0.7430555555555555 | 123.758 |
| 0.74375 | 123.758 |
| 0.7444444444444445 | 128.284 |
| 0.7451388888888889 | 132.814 |
| 0.7458333333333332 | 132.814 |
| 0.7465277777777778 | 128.284 |
| 0.7472222222222222 | 123.758 |
| 0.7479166666666667 | 119.235 |
| 0.748611111111111 | 114.716 |
| 0.7493055555555556 | 110.201 |
| 0.75 | 105.69 |
| 0.7506944444444444 | 105.69 |
| 0.751388888888889 | 105.69 |
| 0.7520833333333333 | 110.201 |
| 0.7527777777777778 | 110.201 |
| 0.7534722222222222 | 105.69 |
| 0.7541666666666668 | 105.69 |
| 0.7548611111111111 | 105.69 |
| 0.7555555555555555 | 105.69 |
| 0.75625 | 105.69 |
| 0.7569444444444445 | 105.69 |
| 0.7576388888888889 | 105.69 |
| 0.7583333333333333 | 105.69 |
| 0.7590277777777777 | 105.69 |
| 0.7597222222222223 | 105.69 |
| 0.7604166666666666 | 110.201 |
| 0.7611111111111111 | 114.716 |
| 0.7618055555555556 | 119.235 |
| 0.7625000000000001 | 119.235 |
| 0.7631944444444444 | 119.235 |
| 0.7638888888888888 | 119.235 |
| 0.7645833333333334 | 137.347 |
| 0.7652777777777778 | 137.347 |
| 0.7659722222222222 | 132.814 |
| 0.7666666666666666 | 128.284 |
| 0.7673611111111112 | 128.284 |
| 0.7680555555555556 | 128.284 |
| 0.7687499999999999 | 128.284 |
| 0.7694444444444444 | 128.284 |
| 0.7701388888888889 | 114.716 |
| 0.7708333333333334 | 110.201 |
| 0.7715277777777777 | 119.235 |
| 0.7722222222222223 | 110.201 |
| 0.7729166666666667 | 114.716 |
| 0.7736111111111111 | 119.235 |
| 0.7743055555555555 | 114.716 |
| 0.775 | 119.235 |
| 0.7756944444444445 | 119.235 |
| 0.7763888888888889 | 123.758 |
| 0.7770833333333332 | 123.758 |
| 0.7777777777777778 | 123.758 |
| 0.7784722222222222 | 123.758 |
| 0.7791666666666667 | 119.235 |
| 0.779861111111111 | 119.235 |
| 0.7805555555555556 | 119.235 |
| 0.78125 | 110.201 |
| 0.7819444444444444 | 101.184 |
| 0.782638888888889 | 92.184 |
| 0.7833333333333333 | 92.184 |
| 0.7840277777777778 | 92.184 |
| 0.7847222222222222 | 83.205 |
| 0.7854166666666668 | 78.722 |
| 0.7861111111111111 | 83.205 |
| 0.7868055555555555 | 78.722 |
| 0.7875 | 69.775 |
| 0.7881944444444445 | 69.775 |
| 0.7888888888888889 | 69.775 |
| 0.7895833333333333 | 65.31 |
| 0.7902777777777777 | 60.85 |
| 0.7909722222222223 | 60.85 |
| 0.7916666666666666 | 56.398 |
| 0.7923611111111111 | 56.398 |
| 0.7930555555555556 | 47.511 |
| 0.7937500000000001 | 43.079 |
| 0.7944444444444444 | 43.079 |
| 0.7951388888888888 | 43.079 |
| 0.7958333333333334 | 38.653 |
| 0.7965277777777778 | 38.653 |
| 0.7972222222222222 | 38.653 |
| 0.7979166666666666 | 38.653 |
| 0.7986111111111112 | 34.234 |
| 0.7993055555555556 | 34.234 |
| 0.7999999999999999 | 34.234 |
| 0.8006944444444444 | 34.234 |
| 0.8013888888888889 | 34.234 |
| 0.8020833333333334 | 38.653 |
| 0.8027777777777777 | 38.653 |
| 0.8034722222222223 | 34.234 |
| 0.8041666666666667 | 34.234 |
| 0.8048611111111111 | 34.234 |
| 0.8055555555555555 | 34.234 |
| 0.80625 | 34.234 |
| 0.8069444444444445 | 34.234 |
| 0.8076388888888889 | 34.234 |
| 0.8083333333333332 | 34.234 |
| 0.8090277777777778 | 34.234 |
| 0.8097222222222222 | 34.234 |
| 0.8104166666666667 | 29.823 |
| 0.811111111111111 | 29.823 |
| 0.8118055555555556 | 29.823 |
| 0.8125 | 29.823 |
| 0.8131944444444444 | 25.419 |
| 0.813888888888889 | 25.419 |
| 0.8145833333333333 | 25.419 |
| 0.8152777777777778 | 25.419 |
| 0.8159722222222222 | 25.419 |
| 0.8166666666666668 | 25.419 |
| 0.8173611111111111 | 25.419 |
| 0.8180555555555555 | 21.024 |
| 0.81875 | 21.024 |
| 0.8194444444444445 | 21.024 |
| 0.8201388888888889 | 21.024 |
| 0.8208333333333333 | 21.024 |
| 0.8215277777777777 | 16.636 |
| 0.8222222222222223 | 16.636 |
| 0.8229166666666666 | 16.636 |
| 0.8236111111111111 | 16.636 |
| 0.8243055555555556 | 12.257 |
| 0.8250000000000001 | 12.257 |
| 0.8256944444444444 | 12.257 |
| 0.8263888888888888 | 12.257 |
| 0.8270833333333334 | 12.257 |
| 0.8277777777777778 | 7.887 |
| 0.8284722222222222 | 7.887 |
| 0.8291666666666666 | 7.887 |
| 0.8298611111111112 | 7.887 |
| 0.8305555555555556 | 7.887 |
| 0.8312499999999999 | 7.887 |
| 0.8319444444444444 | 3.525 |
| 0.8326388888888889 | 3.525 |
| 0.8333333333333334 | 3.525 |
| 0.8340277777777777 | 3.525 |
| 0.8347222222222223 | 3.525 |
| 0.8354166666666667 | 3.525 |
| 0.8361111111111111 | 3.525 |
| 0.8368055555555555 | 3.525 |
| 0.8375 | 3.525 |
| 0.8381944444444445 | 0 |
| 0.8388888888888889 | 0 |
| 0.8395833333333332 | 0 |
| 0.8402777777777778 | 0 |
| 0.8409722222222222 | 0 |
| 0.8416666666666667 | 0 |
| 0.842361111111111 | 0 |
| 0.8430555555555556 | 0 |
| 0.84375 | 0 |
| 0.8444444444444444 | 0 |
| 0.845138888888889 | 0 |
| 0.8458333333333333 | 0 |
| 0.8465277777777778 | 0 |
| 0.8472222222222222 | 0 |
| 0.8479166666666668 | 0 |
| 0.8486111111111111 | 0 |
| 0.8493055555555555 | 0 |
| 0.85 | 0 |
| 0.8506944444444445 | 0 |
| 0.8513888888888889 | 0 |
| 0.8520833333333333 | 0 |
| 0.8527777777777777 | 0 |
| 0.8534722222222223 | 0 |
| 0.8541666666666666 | 0 |
| 0.8548611111111111 | 0 |
| 0.8555555555555556 | 0 |
| 0.8562500000000001 | 0 |
| 0.8569444444444444 | 0 |
| 0.8576388888888888 | 0 |
| 0.8583333333333334 | 0 |
| 0.8590277777777778 | 0 |
| 0.8597222222222222 | 0 |
| 0.8604166666666666 | 0 |
| 0.8611111111111112 | 0 |
| 0.8618055555555556 | 0 |
| 0.8624999999999999 | 0 |
| 0.8631944444444444 | 0 |
| 0.8638888888888889 | 0 |
| 0.8645833333333334 | 0 |
| 0.8652777777777777 | 0 |
| 0.8659722222222223 | 0 |
| 0.8666666666666667 | 0 |
| 0.8673611111111111 | 0 |
| 0.8680555555555555 | 0 |
| 0.86875 | 0 |
| 0.8694444444444445 | 0 |
| 0.8701388888888889 | 0 |
| 0.8708333333333332 | 0 |
| 0.8715277777777778 | 0 |
| 0.8722222222222222 | 0 |
| 0.8729166666666667 | 0 |
| 0.873611111111111 | 0 |
| 0.8743055555555556 | 0 |
| 0.875 | 0 |
| 0.8756944444444444 | 0 |
| 0.876388888888889 | 0 |
| 0.8770833333333333 | 0 |
| 0.8777777777777778 | 0 |
| 0.8784722222222222 | 0 |
| 0.8791666666666668 | 0 |
| 0.8798611111111111 | 0 |
| 0.8805555555555555 | 0 |
| 0.88125 | 0 |
| 0.8819444444444445 | 0 |
| 0.8826388888888889 | 0 |
| 0.8833333333333333 | 0 |
| 0.8840277777777777 | 0 |
| 0.8847222222222223 | 0 |
| 0.8854166666666666 | 0 |
| 0.8861111111111111 | 0 |
| 0.8868055555555556 | 0 |
| 0.8875000000000001 | 0 |
| 0.8881944444444444 | 0 |
| 0.8888888888888888 | 0 |
| 0.8895833333333334 | 0 |
| 0.8902777777777778 | 0 |
| 0.8909722222222222 | 0 |
| 0.8916666666666666 | 0 |
| 0.8923611111111112 | 0 |
| 0.8930555555555556 | 0 |
| 0.8937499999999999 | 0 |
| 0.8944444444444444 | 0 |
| 0.8951388888888889 | 0 |
| 0.8958333333333334 | 0 |
| 0.8965277777777777 | 0 |
| 0.8972222222222223 | 0 |
| 0.8979166666666667 | 0 |
| 0.8986111111111111 | 0 |
| 0.8993055555555555 | 0 |
| 0.9 | 0 |
| 0.9006944444444445 | 0 |
| 0.9013888888888889 | 0 |
| 0.9020833333333332 | 0 |
| 0.9027777777777778 | 0 |
| 0.9034722222222222 | 0 |
| 0.9041666666666667 | 0 |
| 0.904861111111111 | 0 |
| 0.9055555555555556 | 0 |
| 0.90625 | 0 |
| 0.9069444444444444 | 0 |
| 0.907638888888889 | 0 |
| 0.9083333333333333 | 0 |
| 0.9090277777777778 | 0 |
| 0.9097222222222222 | 0 |
| 0.9104166666666668 | 0 |
| 0.9111111111111111 | 0 |
| 0.9118055555555555 | 0 |
| 0.9125 | 0 |
| 0.9131944444444445 | 0 |
| 0.9138888888888889 | 0 |
| 0.9145833333333333 | 0 |
| 0.9152777777777777 | 0 |
| 0.9159722222222223 | 0 |
| 0.9166666666666666 | 0 |
| 0.9173611111111111 | 0 |
| 0.9180555555555556 | 0 |
| 0.9187500000000001 | 0 |
| 0.9194444444444444 | 0 |
| 0.9201388888888888 | 0 |
| 0.9208333333333334 | 0 |
| 0.9215277777777778 | 0 |
| 0.9222222222222222 | 0 |
| 0.9229166666666666 | 0 |
| 0.9236111111111112 | 0 |
| 0.9243055555555556 | 0 |
| 0.9249999999999999 | 0 |
| 0.9256944444444444 | 0 |
| 0.9263888888888889 | 0 |
| 0.9270833333333334 | 0 |
| 0.9277777777777777 | 0 |
| 0.9284722222222223 | 0 |
| 0.9291666666666667 | 0 |
| 0.9298611111111111 | 0 |
| 0.9305555555555555 | 0 |
| 0.93125 | 0 |
| 0.9319444444444445 | 0 |
| 0.9326388888888889 | 0 |
| 0.9333333333333332 | 0 |
| 0.9340277777777778 | 0 |
| 0.9347222222222222 | 0 |
| 0.9354166666666667 | 0 |
| 0.936111111111111 | 0 |
| 0.9368055555555556 | 0 |
| 0.9375 | 0 |
| 0.9381944444444444 | 0 |
| 0.938888888888889 | 0 |
| 0.9395833333333333 | 0 |
| 0.9402777777777778 | 0 |
| 0.9409722222222222 | 0 |
| 0.9416666666666668 | 0 |
| 0.9423611111111111 | 0 |
| 0.9430555555555555 | 0 |
| 0.94375 | 0 |
| 0.9444444444444445 | 0 |
| 0.9451388888888889 | 0 |
| 0.9458333333333333 | 0 |
| 0.9465277777777777 | 0 |
| 0.9472222222222223 | 0 |
| 0.9479166666666666 | 0 |
| 0.9486111111111111 | 0 |
| 0.9493055555555556 | 0 |
| 0.9500000000000001 | 0 |
| 0.9506944444444444 | 0 |
| 0.9513888888888888 | 0 |
| 0.9520833333333334 | 0 |
| 0.9527777777777778 | 0 |
| 0.9534722222222222 | 0 |
| 0.9541666666666666 | 0 |
| 0.9548611111111112 | 0 |
| 0.9555555555555556 | 0 |
| 0.9562499999999999 | 0 |
| 0.9569444444444444 | 0 |
| 0.9576388888888889 | 0 |
| 0.9583333333333334 | 0 |
| 0.9590277777777777 | 0 |
| 0.9597222222222223 | 0 |
| 0.9604166666666667 | 0 |
| 0.9611111111111111 | 0 |
| 0.9618055555555555 | 0 |
| 0.9625 | 0 |
| 0.9631944444444445 | 0 |
| 0.9638888888888889 | 0 |
| 0.9645833333333332 | 0 |
| 0.9652777777777778 | 0 |
| 0.9659722222222222 | 0 |
| 0.9666666666666667 | 0 |
| 0.967361111111111 | 0 |
| 0.9680555555555556 | 0 |
| 0.96875 | 0 |
| 0.9694444444444444 | 0 |
| 0.970138888888889 | 0 |
| 0.9708333333333333 | 0 |
| 0.9715277777777778 | 0 |
| 0.9722222222222222 | 0 |
| 0.9729166666666668 | 0 |
| 0.9736111111111111 | 0 |
| 0.9743055555555555 | 0 |
| 0.975 | 0 |
| 0.9756944444444445 | 0 |
| 0.9763888888888889 | 0 |
| 0.9770833333333333 | 0 |
| 0.9777777777777777 | 0 |
| 0.9784722222222223 | 0 |
| 0.9791666666666666 | 0 |
| 0.9798611111111111 | 0 |
| 0.9805555555555556 | 0 |
| 0.9812500000000001 | 0 |
| 0.9819444444444444 | 0 |
| 0.9826388888888888 | 0 |
| 0.9833333333333334 | 0 |
| 0.9840277777777778 | 0 |
| 0.9847222222222222 | 0 |
| 0.9854166666666666 | 0 |
| 0.9861111111111112 | 0 |
| 0.9868055555555556 | 0 |
| 0.9874999999999999 | 0 |
| 0.9881944444444444 | 0 |
| 0.9888888888888889 | 0 |
| 0.9895833333333334 | 0 |
| 0.9902777777777777 | 0 |
| 0.9909722222222223 | 0 |
| 0.9916666666666667 | 0 |
| 0.9923611111111111 | 0 |
| 0.9930555555555555 | 0 |
| 0.99375 | 0 |
| 0.9944444444444445 | 0 |
| 0.9951388888888889 | 0 |
| 0.9958333333333332 | 0 |
| 0.9965277777777778 | 0 |
| 0.9972222222222222 | 0 |
| 0.9979166666666667 | 0 |
| 0.998611111111111 | 0 |
| 0.9993055555555556 | 0 |